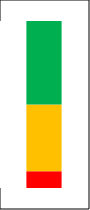
| Category | Series 0 | Series 1 | Series 2 |
|---|---|---|---|
| Summe 1 -10 | 0.1 | 0.4 | 0.5 |